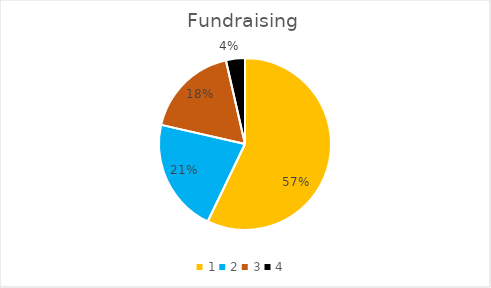
| Category | Series 0 |
|---|---|
| 0 | 0.571 |
| 1 | 0.214 |
| 2 | 0.179 |
| 3 | 0.036 |